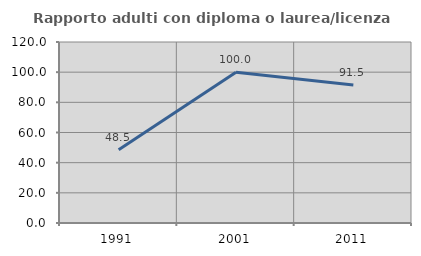
| Category | Rapporto adulti con diploma o laurea/licenza media  |
|---|---|
| 1991.0 | 48.485 |
| 2001.0 | 100 |
| 2011.0 | 91.525 |